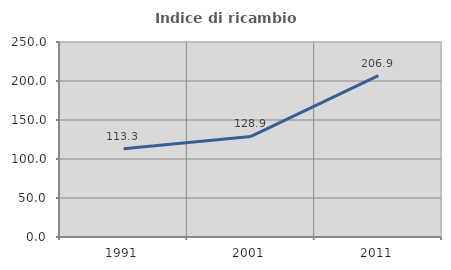
| Category | Indice di ricambio occupazionale  |
|---|---|
| 1991.0 | 113.265 |
| 2001.0 | 128.947 |
| 2011.0 | 206.944 |